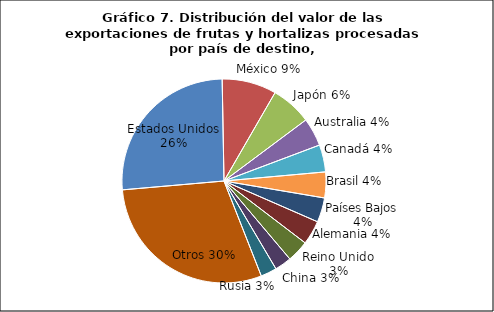
| Category | Series 0 |
|---|---|
| Estados Unidos | 346131126.87 |
| México | 114400259.49 |
| Japón | 85655403.29 |
| Australia | 59304238.62 |
| Canadá | 57068048.17 |
| Brasil | 54272874.74 |
| Países Bajos | 51409088.15 |
| Alemania | 50770600.84 |
| Reino Unido | 45975356.24 |
| China | 35266259.05 |
| Rusia | 33773689.05 |
| Otros | 392066154 |